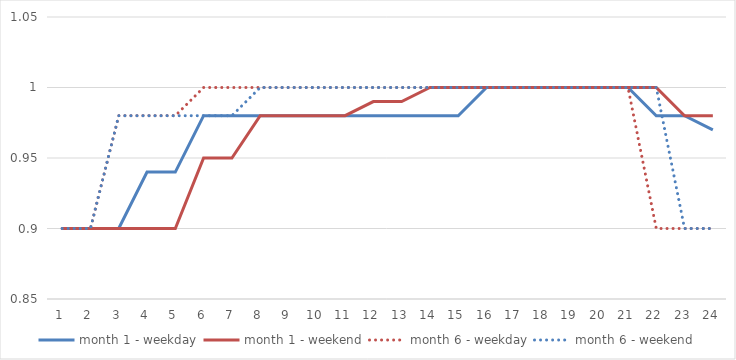
| Category | month 1 - weekday | month 1 - weekend | month 6 - weekday | month 6 - weekend |
|---|---|---|---|---|
| 0 | 0.9 | 0.9 | 0.9 | 0.9 |
| 1 | 0.9 | 0.9 | 0.9 | 0.9 |
| 2 | 0.9 | 0.9 | 0.98 | 0.98 |
| 3 | 0.94 | 0.9 | 0.98 | 0.98 |
| 4 | 0.94 | 0.9 | 0.98 | 0.98 |
| 5 | 0.98 | 0.95 | 1 | 0.98 |
| 6 | 0.98 | 0.95 | 1 | 0.98 |
| 7 | 0.98 | 0.98 | 1 | 1 |
| 8 | 0.98 | 0.98 | 1 | 1 |
| 9 | 0.98 | 0.98 | 1 | 1 |
| 10 | 0.98 | 0.98 | 1 | 1 |
| 11 | 0.98 | 0.99 | 1 | 1 |
| 12 | 0.98 | 0.99 | 1 | 1 |
| 13 | 0.98 | 1 | 1 | 1 |
| 14 | 0.98 | 1 | 1 | 1 |
| 15 | 1 | 1 | 1 | 1 |
| 16 | 1 | 1 | 1 | 1 |
| 17 | 1 | 1 | 1 | 1 |
| 18 | 1 | 1 | 1 | 1 |
| 19 | 1 | 1 | 1 | 1 |
| 20 | 1 | 1 | 1 | 1 |
| 21 | 0.98 | 1 | 0.9 | 1 |
| 22 | 0.98 | 0.98 | 0.9 | 0.9 |
| 23 | 0.97 | 0.98 | 0.9 | 0.9 |